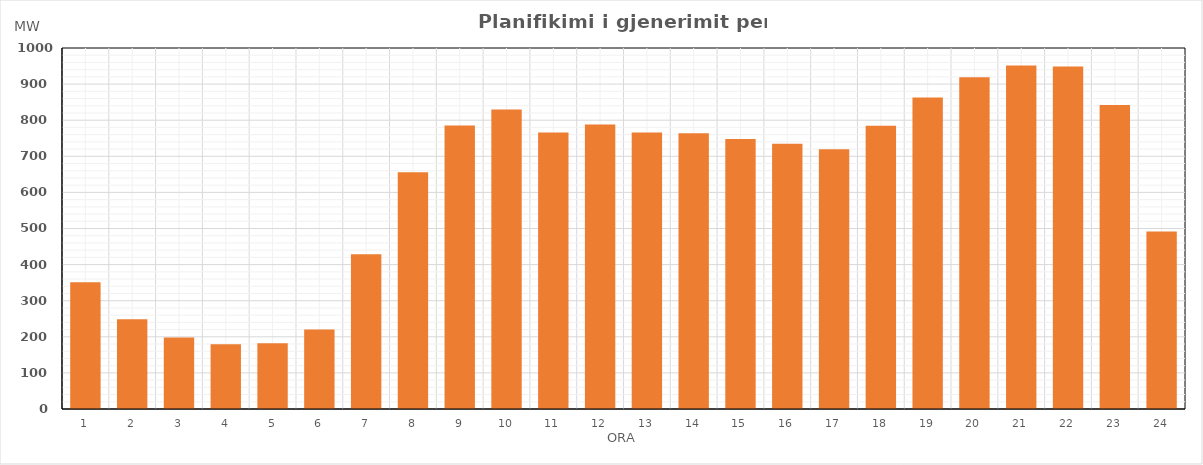
| Category | Max (MW) |
|---|---|
| 0 | 350.988 |
| 1 | 248.554 |
| 2 | 198.334 |
| 3 | 179.244 |
| 4 | 182.219 |
| 5 | 220.313 |
| 6 | 428.738 |
| 7 | 655.669 |
| 8 | 785.198 |
| 9 | 829.734 |
| 10 | 765.81 |
| 11 | 787.854 |
| 12 | 765.719 |
| 13 | 763.789 |
| 14 | 747.729 |
| 15 | 734.684 |
| 16 | 719.649 |
| 17 | 784.624 |
| 18 | 863 |
| 19 | 918.749 |
| 20 | 951.689 |
| 21 | 948.844 |
| 22 | 842.264 |
| 23 | 491.589 |